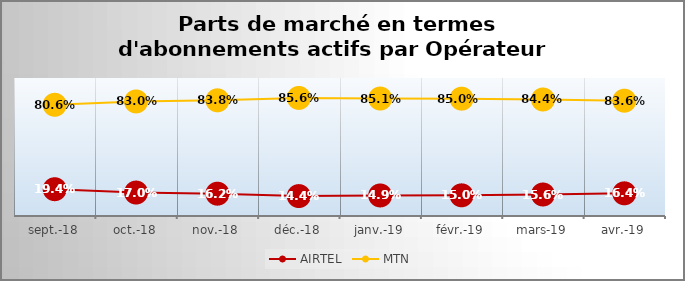
| Category | AIRTEL | MTN |
|---|---|---|
| sept.-18 | 0.194 | 0.806 |
| oct.-18 | 0.17 | 0.83 |
| nov.-18 | 0.162 | 0.838 |
| déc.-18 | 0.144 | 0.856 |
| janv.-19 | 0.149 | 0.851 |
| févr.-19 | 0.15 | 0.85 |
| mars-19 | 0.156 | 0.844 |
| avr.-19 | 0.164 | 0.836 |